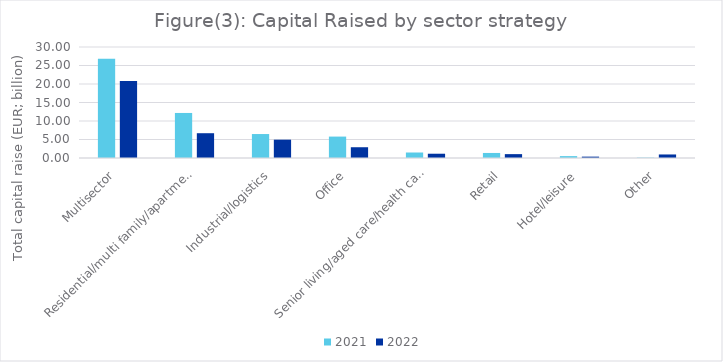
| Category | 2021 | 2022 |
|---|---|---|
| Multisector | 26.819 | 20.797 |
| Residential/multi family/apartments | 12.171 | 6.698 |
| Industrial/logistics | 6.477 | 4.953 |
| Office | 5.788 | 2.91 |
| Senior living/aged care/health care | 1.486 | 1.156 |
| Retail | 1.362 | 1.046 |
| Hotel/leisure | 0.51 | 0.369 |
| Other | 0.094 | 0.955 |